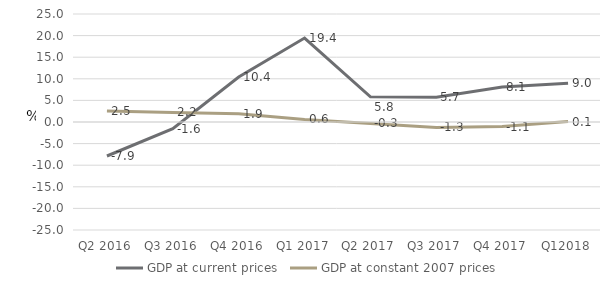
| Category | GDP at current prices  | GDP at constant 2007 prices |
|---|---|---|
| Q2 2016 | -7.87 | 2.537 |
| Q3 2016 | -1.556 | 2.221 |
| Q4 2016 | 10.425 | 1.935 |
| Q1 2017 | 19.43 | 0.595 |
| Q2 2017 | 5.832 | -0.339 |
| Q3 2017 | 5.735 | -1.267 |
| Q4 2017 | 8.076 | -1.06 |
| Q12018 | 8.994 | 0.11 |